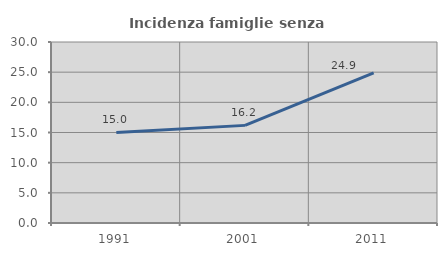
| Category | Incidenza famiglie senza nuclei |
|---|---|
| 1991.0 | 15.005 |
| 2001.0 | 16.181 |
| 2011.0 | 24.869 |